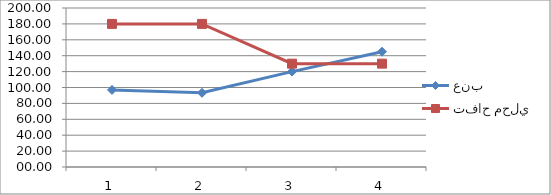
| Category | عنب | تفاح محلي |
|---|---|---|
| 0 | 96.97 | 180 |
| 1 | 93.33 | 180 |
| 2 | 120 | 130 |
| 3 | 145 | 130 |